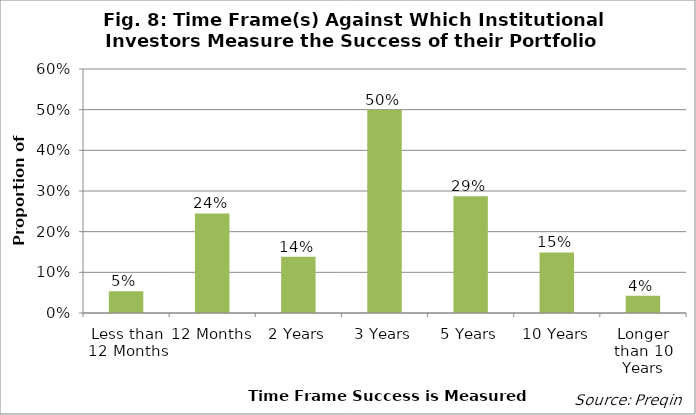
| Category | Proportion |
|---|---|
| Less than 12 Months | 0.053 |
| 12 Months | 0.245 |
| 2 Years | 0.138 |
| 3 Years | 0.5 |
| 5 Years | 0.287 |
| 10 Years | 0.149 |
| Longer than 10 Years | 0.043 |